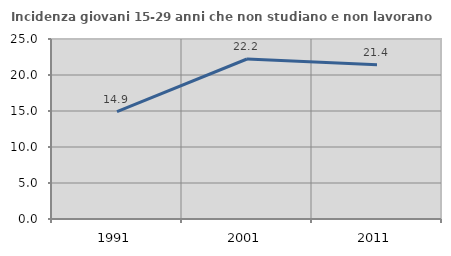
| Category | Incidenza giovani 15-29 anni che non studiano e non lavorano  |
|---|---|
| 1991.0 | 14.908 |
| 2001.0 | 22.222 |
| 2011.0 | 21.429 |